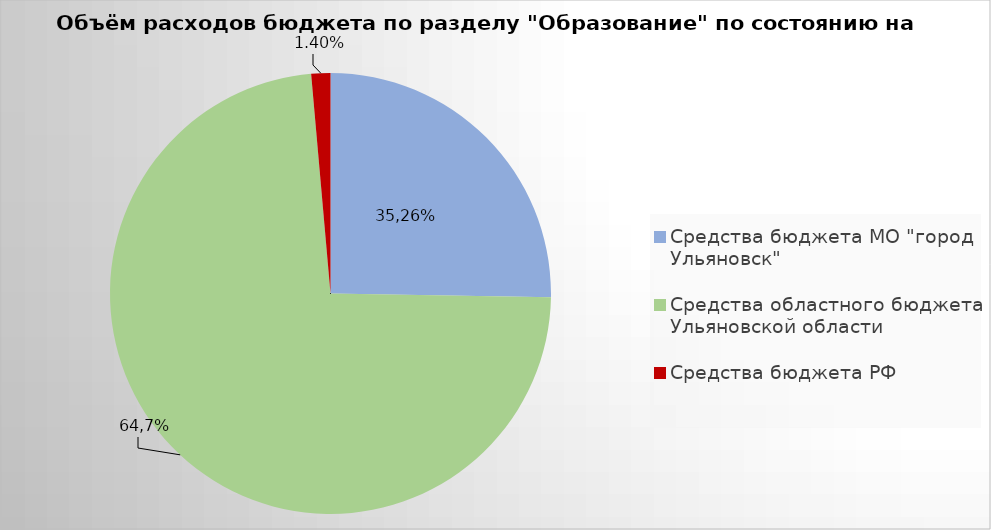
| Category | Series 0 |
|---|---|
| Средства бюджета МО "город Ульяновск" | 1675340.68 |
| Средства областного бюджета Ульяновской области | 4860526.59 |
| Средства бюджета РФ | 92823.5 |